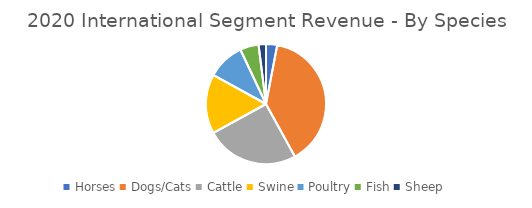
| Category | Series 0 |
|---|---|
| Horses | 0.03 |
| Dogs/Cats | 0.39 |
| Cattle | 0.25 |
| Swine | 0.16 |
| Poultry | 0.1 |
| Fish | 0.05 |
| Sheep | 0.02 |